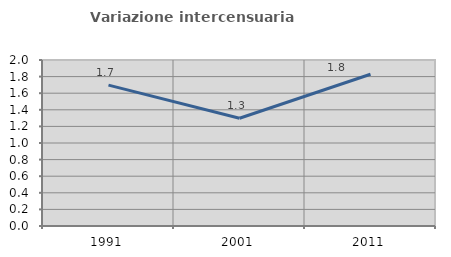
| Category | Variazione intercensuaria annua |
|---|---|
| 1991.0 | 1.697 |
| 2001.0 | 1.298 |
| 2011.0 | 1.828 |